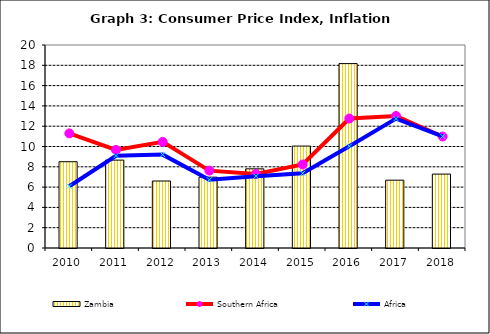
| Category | Zambia |
|---|---|
| 2010.0 | 8.5 |
| 2011.0 | 8.659 |
| 2012.0 | 6.6 |
| 2013.0 | 6.98 |
| 2014.0 | 7.8 |
| 2015.0 | 10.042 |
| 2016.0 | 18.167 |
| 2017.0 | 6.682 |
| 2018.0 | 7.283 |